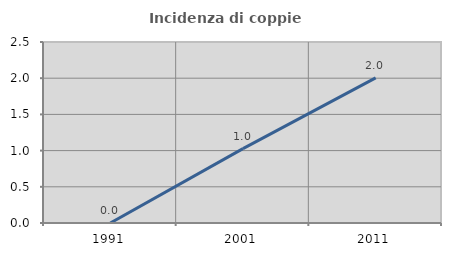
| Category | Incidenza di coppie miste |
|---|---|
| 1991.0 | 0 |
| 2001.0 | 1.028 |
| 2011.0 | 2.003 |